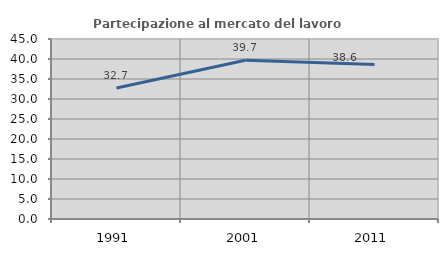
| Category | Partecipazione al mercato del lavoro  femminile |
|---|---|
| 1991.0 | 32.748 |
| 2001.0 | 39.683 |
| 2011.0 | 38.625 |